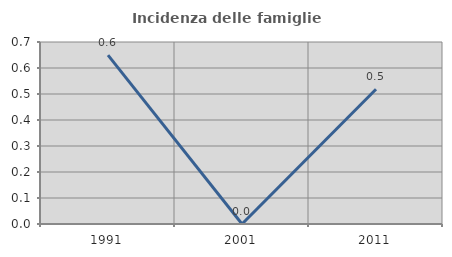
| Category | Incidenza delle famiglie numerose |
|---|---|
| 1991.0 | 0.649 |
| 2001.0 | 0 |
| 2011.0 | 0.518 |